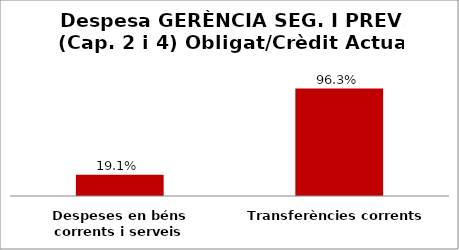
| Category | Series 0 |
|---|---|
| Despeses en béns corrents i serveis | 0.191 |
| Transferències corrents | 0.963 |